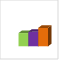
| Category | област Стара Загора |
|---|---|
| летен сезон 2019  | 144294 |
| летен сезон 2021  | 158109 |
| летен сезон 2022 г.  | 200901 |